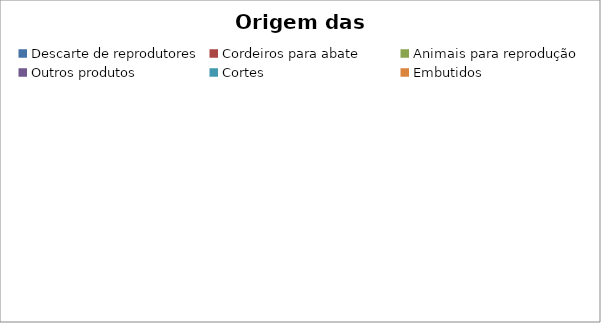
| Category | Series 0 |
|---|---|
| Descarte de reprodutores | 0 |
| Cordeiros para abate | 0 |
| Animais para reprodução | 0 |
| Outros produtos | 0 |
| Cortes | 0 |
| Embutidos | 0 |